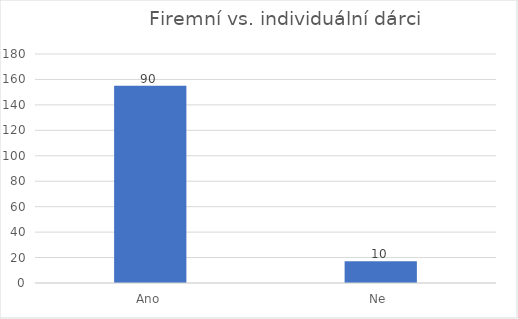
| Category | Počet respondentů |
|---|---|
| Ano | 155 |
| Ne  | 17 |